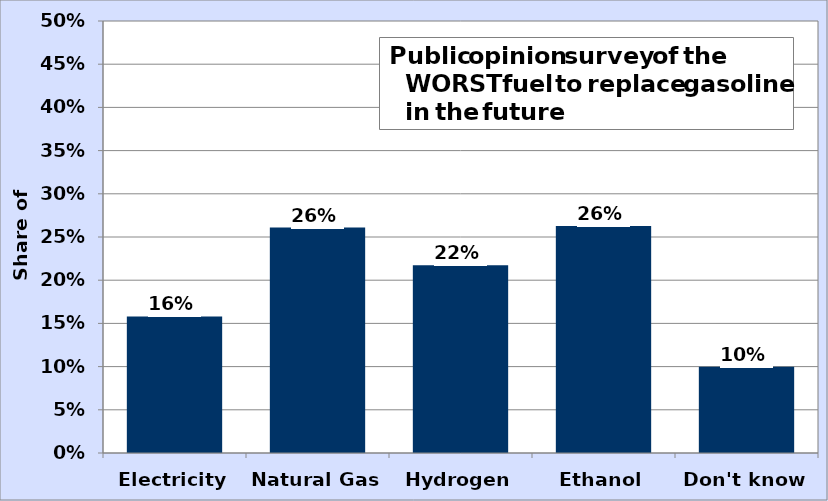
| Category | Series 0 |
|---|---|
| Electricity | 0.158 |
| Natural Gas | 0.261 |
| Hydrogen | 0.217 |
| Ethanol | 0.263 |
| Don't know | 0.1 |